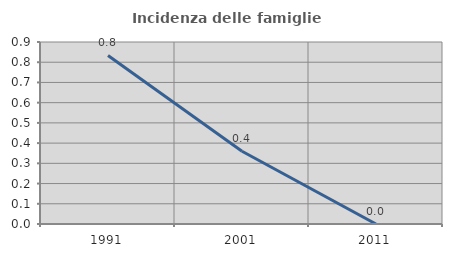
| Category | Incidenza delle famiglie numerose |
|---|---|
| 1991.0 | 0.833 |
| 2001.0 | 0.36 |
| 2011.0 | 0 |